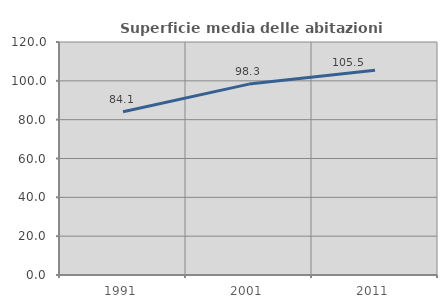
| Category | Superficie media delle abitazioni occupate |
|---|---|
| 1991.0 | 84.098 |
| 2001.0 | 98.321 |
| 2011.0 | 105.465 |